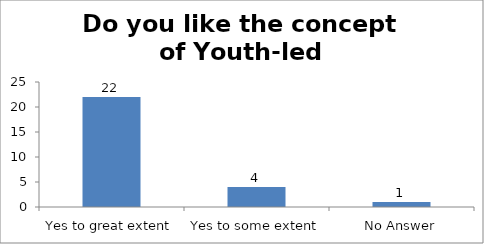
| Category | Do you like the concept of Youth-led Changemaking?  |
|---|---|
| Yes to great extent | 22 |
| Yes to some extent | 4 |
| No Answer | 1 |